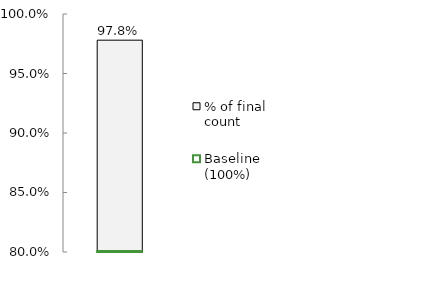
| Category | % of final count |
|---|---|
| 0 | 0.978 |